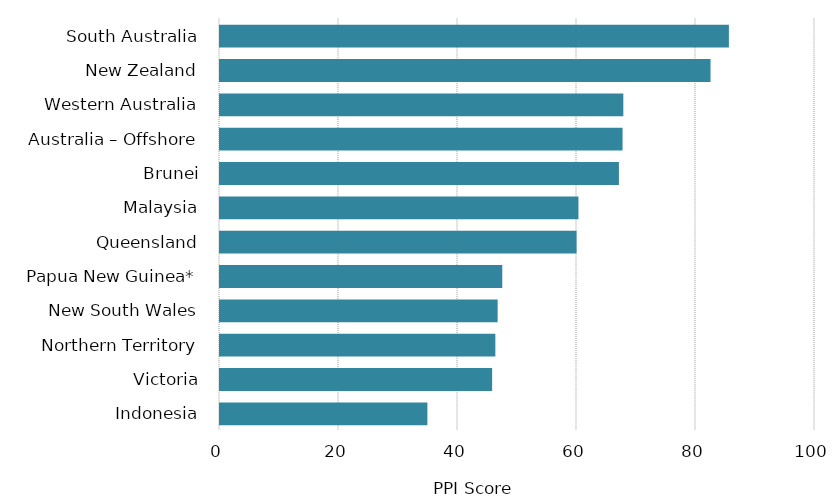
| Category | PPI Score |
|---|---|
| Indonesia | 35.023 |
| Victoria | 45.903 |
| Northern Territory | 46.447 |
| New South Wales | 46.829 |
| Papua New Guinea* | 47.609 |
| Queensland | 60.093 |
| Malaysia | 60.41 |
| Brunei | 67.21 |
| Australia – Offshore | 67.824 |
| Western Australia | 67.952 |
| New Zealand | 82.609 |
| South Australia | 85.696 |